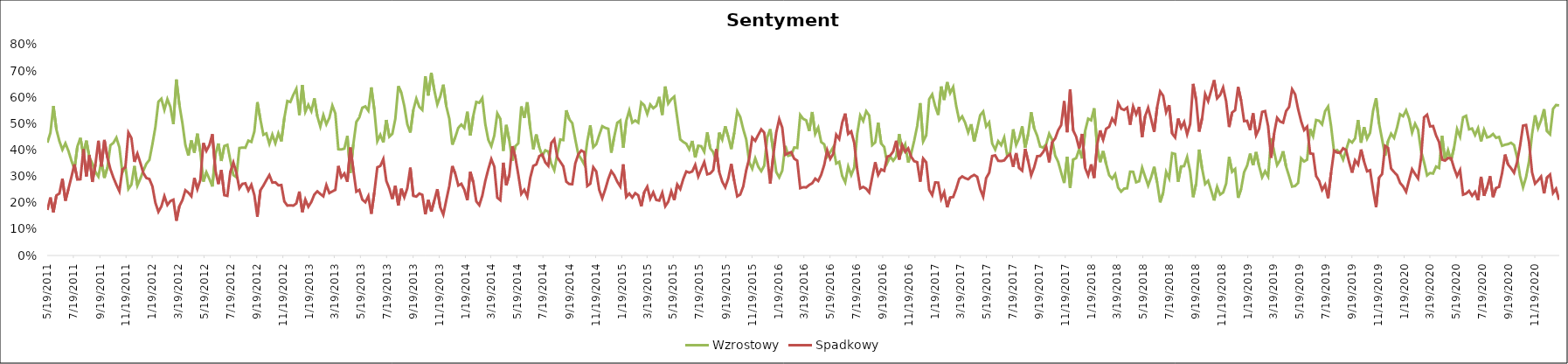
| Category | Wzrostowy | Spadkowy |
|---|---|---|
| 5/19/11 | 0.428 | 0.173 |
| 5/26/11 | 0.465 | 0.22 |
| 6/2/11 | 0.567 | 0.164 |
| 6/9/11 | 0.478 | 0.228 |
| 6/16/11 | 0.434 | 0.235 |
| 6/23/11 | 0.402 | 0.291 |
| 6/30/11 | 0.426 | 0.208 |
| 7/7/11 | 0.397 | 0.252 |
| 7/14/11 | 0.36 | 0.297 |
| 7/21/11 | 0.327 | 0.346 |
| 7/28/11 | 0.413 | 0.288 |
| 8/4/11 | 0.446 | 0.289 |
| 8/11/11 | 0.382 | 0.403 |
| 8/18/11 | 0.436 | 0.3 |
| 8/25/11 | 0.372 | 0.38 |
| 9/1/11 | 0.349 | 0.279 |
| 9/8/11 | 0.317 | 0.345 |
| 9/15/11 | 0.299 | 0.435 |
| 9/22/11 | 0.358 | 0.338 |
| 9/29/11 | 0.295 | 0.438 |
| 10/6/11 | 0.333 | 0.372 |
| 10/13/11 | 0.418 | 0.328 |
| 10/20/11 | 0.427 | 0.295 |
| 10/27/11 | 0.447 | 0.268 |
| 11/3/11 | 0.41 | 0.244 |
| 11/10/11 | 0.315 | 0.327 |
| 11/17/11 | 0.34 | 0.334 |
| 11/24/11 | 0.252 | 0.466 |
| 12/1/11 | 0.269 | 0.446 |
| 12/8/11 | 0.34 | 0.355 |
| 12/15/11 | 0.265 | 0.387 |
| 12/22/11 | 0.292 | 0.351 |
| 12/29/11 | 0.322 | 0.312 |
| 1/5/12 | 0.348 | 0.294 |
| 1/12/12 | 0.363 | 0.29 |
| 1/19/12 | 0.422 | 0.263 |
| 1/26/12 | 0.487 | 0.2 |
| 2/2/12 | 0.583 | 0.166 |
| 2/9/12 | 0.595 | 0.186 |
| 2/16/12 | 0.553 | 0.225 |
| 2/23/12 | 0.593 | 0.192 |
| 3/1/12 | 0.564 | 0.207 |
| 3/8/12 | 0.498 | 0.212 |
| 3/15/12 | 0.668 | 0.132 |
| 3/22/12 | 0.571 | 0.187 |
| 3/29/12 | 0.503 | 0.21 |
| 4/5/12 | 0.419 | 0.248 |
| 4/12/12 | 0.379 | 0.238 |
| 4/19/12 | 0.436 | 0.225 |
| 4/26/12 | 0.39 | 0.294 |
| 5/3/12 | 0.462 | 0.252 |
| 5/10/12 | 0.393 | 0.286 |
| 5/17/12 | 0.28 | 0.427 |
| 5/24/12 | 0.316 | 0.397 |
| 5/31/12 | 0.291 | 0.419 |
| 6/7/12 | 0.262 | 0.46 |
| 6/14/12 | 0.382 | 0.324 |
| 6/21/12 | 0.425 | 0.271 |
| 6/28/12 | 0.359 | 0.324 |
| 7/5/12 | 0.415 | 0.229 |
| 7/12/12 | 0.42 | 0.226 |
| 7/19/12 | 0.36 | 0.318 |
| 7/26/12 | 0.305 | 0.353 |
| 8/2/12 | 0.297 | 0.314 |
| 8/9/12 | 0.408 | 0.255 |
| 8/16/12 | 0.409 | 0.272 |
| 8/23/12 | 0.409 | 0.274 |
| 8/30/12 | 0.436 | 0.246 |
| 9/6/12 | 0.431 | 0.268 |
| 9/13/12 | 0.47 | 0.229 |
| 9/20/12 | 0.582 | 0.147 |
| 9/27/12 | 0.517 | 0.247 |
| 10/4/12 | 0.458 | 0.265 |
| 10/11/12 | 0.463 | 0.286 |
| 10/18/12 | 0.424 | 0.305 |
| 10/25/12 | 0.458 | 0.277 |
| 11/1/12 | 0.426 | 0.278 |
| 11/8/12 | 0.464 | 0.266 |
| 11/15/12 | 0.433 | 0.267 |
| 11/22/12 | 0.522 | 0.205 |
| 11/29/12 | 0.586 | 0.189 |
| 12/6/12 | 0.582 | 0.19 |
| 12/13/12 | 0.61 | 0.189 |
| 12/20/12 | 0.632 | 0.198 |
| 12/27/12 | 0.533 | 0.243 |
| 1/3/13 | 0.647 | 0.165 |
| 1/10/13 | 0.545 | 0.212 |
| 1/17/13 | 0.571 | 0.185 |
| 1/24/13 | 0.548 | 0.203 |
| 1/31/13 | 0.596 | 0.231 |
| 2/7/13 | 0.528 | 0.243 |
| 2/14/13 | 0.489 | 0.233 |
| 2/21/13 | 0.533 | 0.225 |
| 2/28/13 | 0.498 | 0.267 |
| 3/7/13 | 0.522 | 0.237 |
| 3/14/13 | 0.569 | 0.243 |
| 3/21/13 | 0.539 | 0.249 |
| 3/28/13 | 0.403 | 0.34 |
| 4/4/13 | 0.402 | 0.297 |
| 4/11/13 | 0.406 | 0.311 |
| 4/18/13 | 0.453 | 0.28 |
| 4/25/13 | 0.313 | 0.41 |
| 5/2/13 | 0.422 | 0.325 |
| 5/9/13 | 0.507 | 0.242 |
| 5/16/13 | 0.524 | 0.249 |
| 5/23/13 | 0.561 | 0.212 |
| 5/30/13 | 0.566 | 0.202 |
| 6/6/13 | 0.549 | 0.225 |
| 6/13/13 | 0.638 | 0.158 |
| 6/20/13 | 0.553 | 0.24 |
| 6/27/13 | 0.433 | 0.335 |
| 7/4/13 | 0.458 | 0.34 |
| 7/11/13 | 0.429 | 0.366 |
| 7/18/13 | 0.514 | 0.283 |
| 7/25/13 | 0.451 | 0.254 |
| 8/1/13 | 0.462 | 0.214 |
| 8/8/13 | 0.519 | 0.265 |
| 8/15/13 | 0.642 | 0.19 |
| 8/22/13 | 0.618 | 0.253 |
| 8/29/13 | 0.567 | 0.221 |
| 9/5/13 | 0.498 | 0.255 |
| 9/12/13 | 0.467 | 0.333 |
| 9/19/13 | 0.552 | 0.226 |
| 9/26/13 | 0.595 | 0.224 |
| 10/3/13 | 0.564 | 0.235 |
| 10/10/13 | 0.552 | 0.23 |
| 10/17/13 | 0.68 | 0.156 |
| 10/24/13 | 0.607 | 0.211 |
| 10/31/13 | 0.693 | 0.167 |
| 11/7/13 | 0.627 | 0.209 |
| 11/14/13 | 0.573 | 0.252 |
| 11/21/13 | 0.604 | 0.182 |
| 11/28/13 | 0.648 | 0.155 |
| 12/5/13 | 0.566 | 0.211 |
| 12/12/13 | 0.519 | 0.264 |
| 12/19/13 | 0.42 | 0.339 |
| 12/26/13 | 0.45 | 0.31 |
| 1/2/14 | 0.484 | 0.266 |
| 1/9/14 | 0.497 | 0.272 |
| 1/16/14 | 0.484 | 0.25 |
| 1/23/14 | 0.545 | 0.21 |
| 1/30/14 | 0.455 | 0.317 |
| 2/6/14 | 0.531 | 0.278 |
| 2/13/14 | 0.582 | 0.205 |
| 2/20/14 | 0.579 | 0.191 |
| 2/27/14 | 0.597 | 0.227 |
| 3/6/14 | 0.498 | 0.283 |
| 3/13/14 | 0.439 | 0.327 |
| 3/20/14 | 0.415 | 0.366 |
| 3/27/14 | 0.455 | 0.337 |
| 4/3/14 | 0.539 | 0.219 |
| 4/10/14 | 0.519 | 0.21 |
| 4/17/14 | 0.397 | 0.352 |
| 4/24/14 | 0.495 | 0.266 |
| 5/1/14 | 0.437 | 0.306 |
| 5/8/14 | 0.359 | 0.415 |
| 5/15/14 | 0.414 | 0.374 |
| 5/22/14 | 0.425 | 0.307 |
| 5/29/14 | 0.566 | 0.234 |
| 6/5/14 | 0.522 | 0.249 |
| 6/12/14 | 0.581 | 0.224 |
| 6/19/14 | 0.482 | 0.295 |
| 6/26/14 | 0.403 | 0.34 |
| 7/3/14 | 0.459 | 0.345 |
| 7/10/14 | 0.41 | 0.377 |
| 7/17/14 | 0.379 | 0.383 |
| 7/24/14 | 0.399 | 0.353 |
| 7/31/14 | 0.394 | 0.34 |
| 8/7/14 | 0.348 | 0.427 |
| 8/14/14 | 0.324 | 0.441 |
| 8/21/14 | 0.386 | 0.373 |
| 8/28/14 | 0.44 | 0.356 |
| 9/4/14 | 0.438 | 0.338 |
| 9/11/14 | 0.551 | 0.28 |
| 9/18/14 | 0.516 | 0.271 |
| 9/25/14 | 0.502 | 0.271 |
| 10/2/14 | 0.441 | 0.349 |
| 10/9/14 | 0.383 | 0.383 |
| 10/16/14 | 0.366 | 0.398 |
| 10/23/14 | 0.345 | 0.392 |
| 10/30/14 | 0.433 | 0.264 |
| 11/6/14 | 0.494 | 0.272 |
| 11/13/14 | 0.411 | 0.335 |
| 11/20/14 | 0.422 | 0.319 |
| 11/27/14 | 0.457 | 0.248 |
| 12/4/14 | 0.49 | 0.217 |
| 12/11/14 | 0.484 | 0.251 |
| 12/18/14 | 0.481 | 0.29 |
| 12/25/14 | 0.39 | 0.32 |
| 1/1/15 | 0.451 | 0.304 |
| 1/8/15 | 0.503 | 0.28 |
| 1/15/15 | 0.512 | 0.262 |
| 1/22/15 | 0.409 | 0.346 |
| 1/29/15 | 0.511 | 0.222 |
| 2/5/15 | 0.55 | 0.235 |
| 2/12/15 | 0.504 | 0.22 |
| 2/19/15 | 0.512 | 0.236 |
| 2/26/15 | 0.504 | 0.228 |
| 3/5/15 | 0.581 | 0.186 |
| 3/12/15 | 0.57 | 0.241 |
| 3/19/15 | 0.537 | 0.261 |
| 3/26/15 | 0.573 | 0.216 |
| 4/2/15 | 0.559 | 0.239 |
| 4/9/15 | 0.568 | 0.211 |
| 4/16/15 | 0.602 | 0.208 |
| 4/23/15 | 0.533 | 0.238 |
| 4/30/15 | 0.641 | 0.187 |
| 5/7/15 | 0.577 | 0.204 |
| 5/14/15 | 0.593 | 0.243 |
| 5/21/15 | 0.603 | 0.21 |
| 5/28/15 | 0.521 | 0.269 |
| 6/4/15 | 0.44 | 0.252 |
| 6/11/15 | 0.431 | 0.29 |
| 6/18/15 | 0.424 | 0.319 |
| 6/25/15 | 0.403 | 0.314 |
| 7/2/15 | 0.435 | 0.319 |
| 7/9/15 | 0.372 | 0.344 |
| 7/16/15 | 0.416 | 0.3 |
| 7/23/15 | 0.415 | 0.327 |
| 7/30/15 | 0.393 | 0.354 |
| 8/6/15 | 0.467 | 0.308 |
| 8/13/15 | 0.407 | 0.311 |
| 8/20/15 | 0.392 | 0.324 |
| 8/27/15 | 0.357 | 0.403 |
| 9/3/15 | 0.466 | 0.316 |
| 9/10/15 | 0.44 | 0.28 |
| 9/17/15 | 0.49 | 0.259 |
| 9/24/15 | 0.451 | 0.292 |
| 10/1/15 | 0.404 | 0.347 |
| 10/8/15 | 0.466 | 0.283 |
| 10/15/15 | 0.547 | 0.224 |
| 10/22/15 | 0.525 | 0.231 |
| 10/29/15 | 0.479 | 0.262 |
| 11/5/15 | 0.44 | 0.324 |
| 11/12/15 | 0.354 | 0.369 |
| 11/19/15 | 0.329 | 0.447 |
| 11/26/15 | 0.369 | 0.435 |
| 12/3/15 | 0.337 | 0.457 |
| 12/10/15 | 0.32 | 0.478 |
| 12/17/15 | 0.341 | 0.466 |
| 12/24/15 | 0.449 | 0.374 |
| 12/31/15 | 0.479 | 0.273 |
| 1/7/16 | 0.398 | 0.378 |
| 1/14/16 | 0.317 | 0.466 |
| 1/21/16 | 0.297 | 0.517 |
| 1/28/16 | 0.322 | 0.485 |
| 2/4/16 | 0.415 | 0.382 |
| 2/11/16 | 0.378 | 0.388 |
| 2/18/16 | 0.381 | 0.392 |
| 2/25/16 | 0.41 | 0.367 |
| 3/3/16 | 0.408 | 0.36 |
| 3/10/16 | 0.533 | 0.256 |
| 3/17/16 | 0.518 | 0.259 |
| 3/24/16 | 0.513 | 0.258 |
| 3/31/16 | 0.472 | 0.268 |
| 4/7/16 | 0.544 | 0.274 |
| 4/14/16 | 0.461 | 0.292 |
| 4/21/16 | 0.485 | 0.283 |
| 4/28/16 | 0.43 | 0.307 |
| 5/5/16 | 0.422 | 0.343 |
| 5/12/16 | 0.375 | 0.399 |
| 5/19/16 | 0.392 | 0.367 |
| 5/26/16 | 0.411 | 0.386 |
| 6/2/16 | 0.349 | 0.458 |
| 6/9/16 | 0.355 | 0.442 |
| 6/16/16 | 0.302 | 0.504 |
| 6/23/16 | 0.278 | 0.538 |
| 6/30/16 | 0.337 | 0.461 |
| 7/7/16 | 0.305 | 0.471 |
| 7/14/16 | 0.333 | 0.428 |
| 7/21/16 | 0.462 | 0.327 |
| 7/28/16 | 0.531 | 0.254 |
| 8/4/16 | 0.51 | 0.26 |
| 8/11/16 | 0.548 | 0.253 |
| 8/18/16 | 0.531 | 0.239 |
| 8/25/16 | 0.419 | 0.297 |
| 9/1/16 | 0.429 | 0.354 |
| 9/8/16 | 0.504 | 0.306 |
| 9/15/16 | 0.424 | 0.327 |
| 9/22/16 | 0.412 | 0.321 |
| 9/29/16 | 0.351 | 0.375 |
| 10/6/16 | 0.375 | 0.379 |
| 10/13/16 | 0.36 | 0.395 |
| 10/20/16 | 0.375 | 0.435 |
| 10/27/16 | 0.461 | 0.364 |
| 11/3/16 | 0.396 | 0.419 |
| 11/10/16 | 0.421 | 0.394 |
| 11/17/16 | 0.353 | 0.406 |
| 11/24/16 | 0.387 | 0.374 |
| 12/1/16 | 0.436 | 0.358 |
| 12/8/16 | 0.491 | 0.354 |
| 12/15/16 | 0.578 | 0.28 |
| 12/22/16 | 0.433 | 0.368 |
| 12/29/16 | 0.455 | 0.354 |
| 1/5/17 | 0.593 | 0.249 |
| 1/12/17 | 0.611 | 0.229 |
| 1/19/17 | 0.566 | 0.277 |
| 1/26/17 | 0.533 | 0.277 |
| 2/2/17 | 0.641 | 0.215 |
| 2/9/17 | 0.59 | 0.24 |
| 2/16/17 | 0.658 | 0.183 |
| 2/23/17 | 0.616 | 0.22 |
| 3/2/17 | 0.639 | 0.222 |
| 3/9/17 | 0.568 | 0.253 |
| 3/16/17 | 0.513 | 0.29 |
| 3/23/17 | 0.528 | 0.3 |
| 3/30/17 | 0.503 | 0.293 |
| 4/6/17 | 0.467 | 0.289 |
| 4/13/17 | 0.498 | 0.3 |
| 4/20/17 | 0.432 | 0.306 |
| 4/27/17 | 0.481 | 0.298 |
| 5/4/17 | 0.532 | 0.252 |
| 5/11/17 | 0.546 | 0.223 |
| 5/18/17 | 0.49 | 0.294 |
| 5/25/17 | 0.505 | 0.314 |
| 6/1/17 | 0.425 | 0.377 |
| 6/8/17 | 0.402 | 0.38 |
| 6/15/17 | 0.434 | 0.359 |
| 6/22/17 | 0.419 | 0.358 |
| 6/29/17 | 0.447 | 0.361 |
| 7/6/17 | 0.379 | 0.375 |
| 7/13/17 | 0.391 | 0.384 |
| 7/20/17 | 0.479 | 0.336 |
| 7/27/17 | 0.42 | 0.389 |
| 8/3/17 | 0.445 | 0.332 |
| 8/10/17 | 0.49 | 0.322 |
| 8/17/17 | 0.409 | 0.405 |
| 8/24/17 | 0.46 | 0.358 |
| 8/31/17 | 0.544 | 0.304 |
| 9/7/17 | 0.482 | 0.335 |
| 9/14/17 | 0.455 | 0.377 |
| 9/21/17 | 0.413 | 0.378 |
| 9/28/17 | 0.409 | 0.392 |
| 10/5/17 | 0.422 | 0.414 |
| 10/12/17 | 0.462 | 0.353 |
| 10/19/17 | 0.439 | 0.43 |
| 10/26/17 | 0.379 | 0.444 |
| 11/2/17 | 0.355 | 0.475 |
| 11/9/17 | 0.315 | 0.494 |
| 11/16/17 | 0.275 | 0.586 |
| 11/23/17 | 0.375 | 0.467 |
| 11/30/17 | 0.257 | 0.63 |
| 12/7/17 | 0.364 | 0.475 |
| 12/14/17 | 0.369 | 0.451 |
| 12/21/17 | 0.403 | 0.407 |
| 12/28/17 | 0.368 | 0.461 |
| 1/4/18 | 0.473 | 0.332 |
| 1/11/18 | 0.519 | 0.304 |
| 1/18/18 | 0.513 | 0.346 |
| 1/25/18 | 0.559 | 0.294 |
| 2/1/18 | 0.412 | 0.421 |
| 2/8/18 | 0.354 | 0.474 |
| 2/15/18 | 0.396 | 0.439 |
| 2/22/18 | 0.347 | 0.481 |
| 3/1/18 | 0.305 | 0.488 |
| 3/8/18 | 0.291 | 0.52 |
| 3/15/18 | 0.308 | 0.502 |
| 3/22/18 | 0.257 | 0.578 |
| 3/29/18 | 0.242 | 0.557 |
| 4/5/18 | 0.254 | 0.552 |
| 4/12/18 | 0.255 | 0.561 |
| 4/19/18 | 0.318 | 0.496 |
| 4/26/18 | 0.317 | 0.565 |
| 5/3/18 | 0.278 | 0.535 |
| 5/10/18 | 0.282 | 0.564 |
| 5/17/18 | 0.333 | 0.449 |
| 5/24/18 | 0.299 | 0.529 |
| 5/31/18 | 0.266 | 0.56 |
| 6/7/18 | 0.297 | 0.517 |
| 6/14/18 | 0.336 | 0.469 |
| 6/21/18 | 0.277 | 0.562 |
| 6/28/18 | 0.202 | 0.622 |
| 7/5/18 | 0.238 | 0.606 |
| 7/12/18 | 0.317 | 0.543 |
| 7/19/18 | 0.293 | 0.57 |
| 7/26/18 | 0.388 | 0.463 |
| 8/2/18 | 0.385 | 0.448 |
| 8/9/18 | 0.279 | 0.52 |
| 8/16/18 | 0.338 | 0.484 |
| 8/23/18 | 0.339 | 0.507 |
| 8/30/18 | 0.374 | 0.46 |
| 9/6/18 | 0.32 | 0.498 |
| 9/13/18 | 0.221 | 0.651 |
| 9/20/18 | 0.273 | 0.59 |
| 9/27/18 | 0.402 | 0.47 |
| 10/4/18 | 0.329 | 0.521 |
| 10/11/18 | 0.271 | 0.612 |
| 10/18/18 | 0.284 | 0.585 |
| 10/25/18 | 0.247 | 0.626 |
| 11/1/18 | 0.209 | 0.665 |
| 11/8/18 | 0.26 | 0.596 |
| 11/15/18 | 0.231 | 0.609 |
| 11/22/18 | 0.239 | 0.637 |
| 11/29/18 | 0.272 | 0.585 |
| 12/6/18 | 0.374 | 0.487 |
| 12/13/18 | 0.317 | 0.543 |
| 12/20/18 | 0.328 | 0.551 |
| 12/27/18 | 0.219 | 0.639 |
| 1/3/19 | 0.253 | 0.588 |
| 1/10/19 | 0.316 | 0.51 |
| 1/17/19 | 0.341 | 0.511 |
| 1/24/19 | 0.387 | 0.476 |
| 1/31/19 | 0.343 | 0.539 |
| 2/7/19 | 0.392 | 0.457 |
| 2/14/19 | 0.339 | 0.481 |
| 2/21/19 | 0.297 | 0.545 |
| 2/28/19 | 0.32 | 0.548 |
| 3/7/19 | 0.3 | 0.491 |
| 3/14/19 | 0.444 | 0.371 |
| 3/21/19 | 0.394 | 0.463 |
| 3/28/19 | 0.343 | 0.522 |
| 4/4/19 | 0.361 | 0.508 |
| 4/11/19 | 0.396 | 0.504 |
| 4/18/19 | 0.337 | 0.548 |
| 4/25/19 | 0.301 | 0.564 |
| 5/2/19 | 0.261 | 0.631 |
| 5/9/19 | 0.264 | 0.612 |
| 5/16/19 | 0.276 | 0.556 |
| 5/23/19 | 0.369 | 0.51 |
| 5/30/19 | 0.357 | 0.476 |
| 6/6/19 | 0.364 | 0.489 |
| 6/13/19 | 0.48 | 0.387 |
| 6/20/19 | 0.453 | 0.385 |
| 6/27/19 | 0.514 | 0.302 |
| 7/4/19 | 0.511 | 0.283 |
| 7/11/19 | 0.497 | 0.249 |
| 7/18/19 | 0.547 | 0.268 |
| 7/25/19 | 0.565 | 0.217 |
| 8/1/19 | 0.49 | 0.315 |
| 8/8/19 | 0.393 | 0.398 |
| 8/15/19 | 0.4 | 0.391 |
| 8/22/19 | 0.389 | 0.389 |
| 8/29/19 | 0.364 | 0.407 |
| 9/5/19 | 0.4 | 0.4 |
| 9/12/19 | 0.438 | 0.354 |
| 9/19/19 | 0.429 | 0.314 |
| 9/26/19 | 0.444 | 0.361 |
| 10/3/19 | 0.514 | 0.345 |
| 10/10/19 | 0.428 | 0.402 |
| 10/17/19 | 0.487 | 0.356 |
| 10/24/19 | 0.443 | 0.32 |
| 10/31/19 | 0.466 | 0.324 |
| 11/7/19 | 0.549 | 0.249 |
| 11/14/19 | 0.597 | 0.183 |
| 11/21/19 | 0.5 | 0.295 |
| 11/28/19 | 0.441 | 0.309 |
| 12/5/19 | 0.379 | 0.416 |
| 12/12/19 | 0.435 | 0.408 |
| 12/19/19 | 0.462 | 0.33 |
| 12/26/19 | 0.446 | 0.317 |
| 1/2/20 | 0.486 | 0.305 |
| 1/9/20 | 0.536 | 0.276 |
| 1/16/20 | 0.528 | 0.262 |
| 1/23/20 | 0.551 | 0.242 |
| 1/30/20 | 0.519 | 0.286 |
| 2/6/20 | 0.466 | 0.327 |
| 2/13/20 | 0.5 | 0.309 |
| 2/20/20 | 0.477 | 0.292 |
| 2/27/20 | 0.396 | 0.37 |
| 3/5/20 | 0.354 | 0.524 |
| 3/12/20 | 0.304 | 0.534 |
| 3/19/20 | 0.313 | 0.49 |
| 3/26/20 | 0.311 | 0.491 |
| 4/2/20 | 0.337 | 0.455 |
| 4/9/20 | 0.332 | 0.43 |
| 4/16/20 | 0.455 | 0.364 |
| 4/23/20 | 0.36 | 0.36 |
| 4/30/20 | 0.399 | 0.37 |
| 5/7/20 | 0.36 | 0.369 |
| 5/14/20 | 0.41 | 0.332 |
| 5/21/20 | 0.48 | 0.301 |
| 5/28/20 | 0.451 | 0.324 |
| 6/4/20 | 0.524 | 0.231 |
| 6/11/20 | 0.53 | 0.235 |
| 6/18/20 | 0.479 | 0.245 |
| 6/25/20 | 0.482 | 0.227 |
| 7/2/20 | 0.457 | 0.241 |
| 7/9/20 | 0.483 | 0.21 |
| 7/16/20 | 0.433 | 0.299 |
| 7/23/20 | 0.477 | 0.227 |
| 7/30/20 | 0.448 | 0.259 |
| 8/6/20 | 0.451 | 0.301 |
| 8/13/20 | 0.461 | 0.222 |
| 8/20/20 | 0.446 | 0.256 |
| 8/27/20 | 0.45 | 0.26 |
| 9/3/20 | 0.416 | 0.312 |
| 9/10/20 | 0.42 | 0.383 |
| 9/17/20 | 0.423 | 0.345 |
| 9/24/20 | 0.428 | 0.331 |
| 10/1/20 | 0.419 | 0.314 |
| 10/8/20 | 0.373 | 0.353 |
| 10/15/20 | 0.301 | 0.416 |
| 10/22/20 | 0.259 | 0.493 |
| 10/29/20 | 0.297 | 0.495 |
| 11/5/20 | 0.357 | 0.43 |
| 11/12/20 | 0.46 | 0.316 |
| 11/19/20 | 0.532 | 0.273 |
| 11/26/20 | 0.483 | 0.285 |
| 12/3/20 | 0.513 | 0.299 |
| 12/10/20 | 0.555 | 0.236 |
| 12/17/20 | 0.471 | 0.296 |
| 12/24/20 | 0.46 | 0.307 |
| 12/31/20 | 0.556 | 0.237 |
| 1/7/21 | 0.571 | 0.253 |
| 1/14/21 | 0.569 | 0.211 |